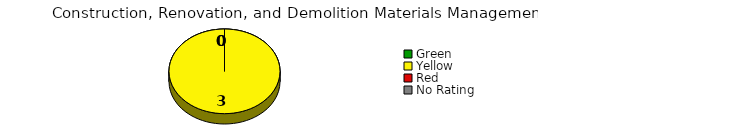
| Category | Counts |
|---|---|
| Green | 0 |
| Yellow | 3 |
| Red | 0 |
| No Rating | 0 |